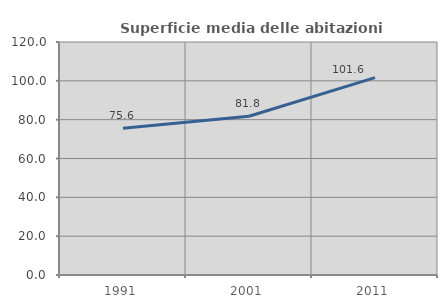
| Category | Superficie media delle abitazioni occupate |
|---|---|
| 1991.0 | 75.555 |
| 2001.0 | 81.789 |
| 2011.0 | 101.638 |